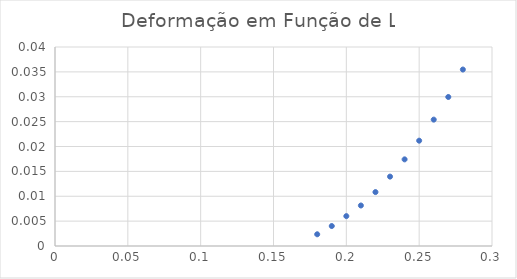
| Category | Deformação (m) |
|---|---|
| 0.28 | 0.035 |
| 0.27 | 0.03 |
| 0.26 | 0.025 |
| 0.25 | 0.021 |
| 0.24 | 0.017 |
| 0.23 | 0.014 |
| 0.22 | 0.011 |
| 0.21 | 0.008 |
| 0.2 | 0.006 |
| 0.19 | 0.004 |
| 0.18 | 0.002 |